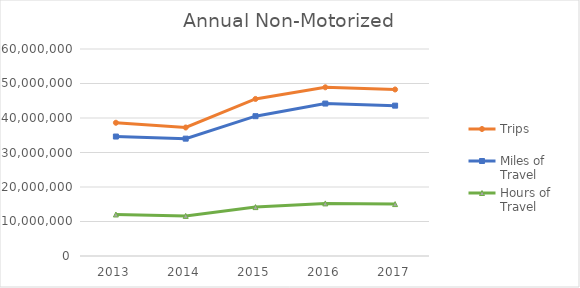
| Category | Trips | Miles of Travel | Hours of Travel |
|---|---|---|---|
| 2013 | 38621533.229 | 34628177.944 | 12031007.839 |
| 2014 | 37245988.15 | 34015705.116 | 11622924.967 |
| 2015 | 45526157.174 | 40527661.849 | 14172294.238 |
| 2016 | 48897229.519 | 44186522.837 | 15243341.628 |
| 2017 | 48267871.179 | 43581892.668 | 15045963.398 |